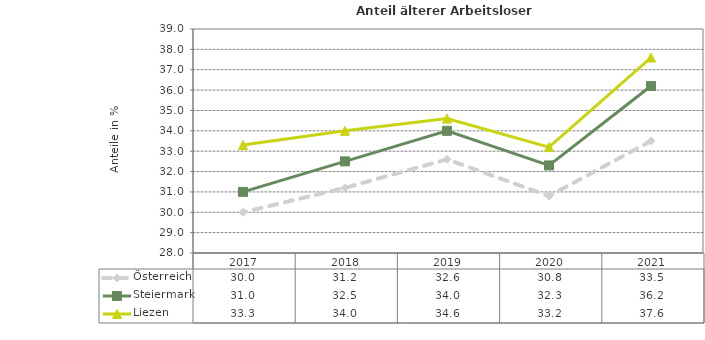
| Category | Österreich | Steiermark | Liezen |
|---|---|---|---|
| 2021.0 | 33.5 | 36.2 | 37.6 |
| 2020.0 | 30.8 | 32.3 | 33.2 |
| 2019.0 | 32.6 | 34 | 34.6 |
| 2018.0 | 31.2 | 32.5 | 34 |
| 2017.0 | 30 | 31 | 33.3 |